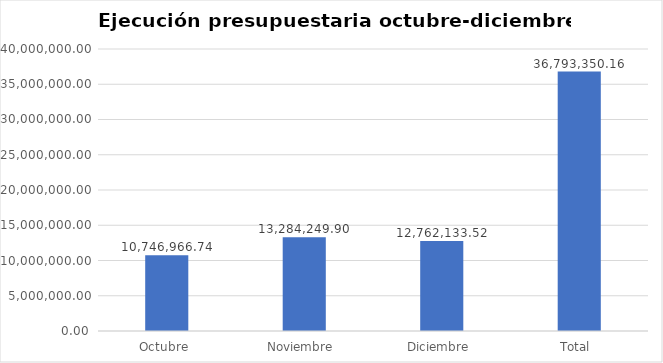
| Category | Series 0 |
|---|---|
| Octubre  | 10746966.74 |
| Noviembre  | 13284249.9 |
| Diciembre  | 12762133.52 |
| Total  | 36793350.16 |